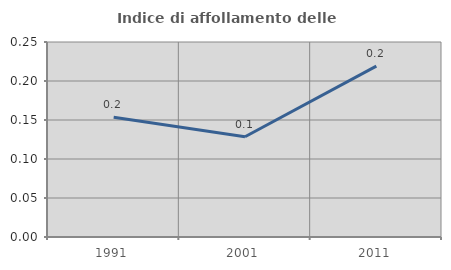
| Category | Indice di affollamento delle abitazioni  |
|---|---|
| 1991.0 | 0.154 |
| 2001.0 | 0.129 |
| 2011.0 | 0.219 |